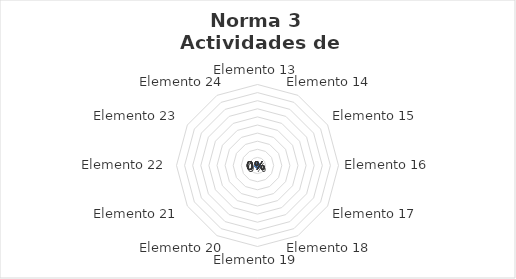
| Category | Series 0 |
|---|---|
| Elemento 13 | 0 |
| Elemento 14 | 0 |
| Elemento 15 | 0 |
| Elemento 16 | 0 |
| Elemento 17 | 0 |
| Elemento 18 | 0 |
| Elemento 19 | 0 |
| Elemento 20 | 0 |
| Elemento 21 | 0 |
| Elemento 22 | 0 |
| Elemento 23 | 0 |
| Elemento 24 | 0 |